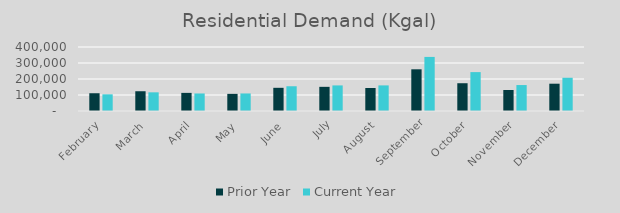
| Category | Prior Year | Current Year |
|---|---|---|
| February | 111009.962 | 104204.224 |
| March | 123525.131 | 116687.491 |
| April | 113258.787 | 109598.965 |
| May | 107128.051 | 109656.015 |
| June | 144930.453 | 154696.236 |
| July | 151028.014 | 159889.353 |
| August | 143816.337 | 160013.985 |
| September | 260607.456 | 337995.641 |
| October | 173601.368 | 243049.084 |
| November | 131198.833 | 162175.563 |
| December | 170629.384 | 207737.904 |